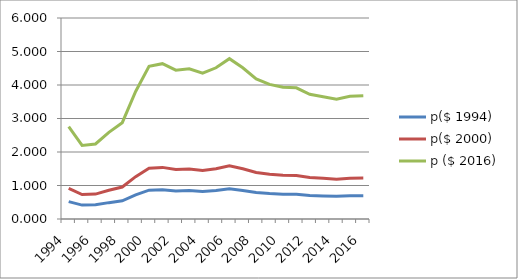
| Category | p($ 1994) | p($ 2000) | p ($ 2016) |
|---|---|---|---|
| 1994.0 | 0.52 | 0.915 | 2.754 |
| 1995.0 | 0.415 | 0.73 | 2.196 |
| 1996.0 | 0.423 | 0.744 | 2.239 |
| 1997.0 | 0.488 | 0.859 | 2.586 |
| 1998.0 | 0.543 | 0.955 | 2.875 |
| 1999.0 | 0.719 | 1.265 | 3.806 |
| 2000.0 | 0.86 | 1.514 | 4.557 |
| 2001.0 | 0.875 | 1.54 | 4.637 |
| 2002.0 | 0.839 | 1.476 | 4.443 |
| 2003.0 | 0.847 | 1.491 | 4.486 |
| 2004.0 | 0.821 | 1.445 | 4.351 |
| 2005.0 | 0.852 | 1.5 | 4.514 |
| 2006.0 | 0.904 | 1.59 | 4.786 |
| 2007.0 | 0.852 | 1.5 | 4.515 |
| 2008.0 | 0.79 | 1.39 | 4.183 |
| 2009.0 | 0.759 | 1.335 | 4.018 |
| 2010.0 | 0.742 | 1.306 | 3.931 |
| 2011.0 | 0.739 | 1.301 | 3.915 |
| 2012.0 | 0.703 | 1.237 | 3.723 |
| 2013.0 | 0.689 | 1.213 | 3.651 |
| 2014.0 | 0.676 | 1.189 | 3.579 |
| 2015.0 | 0.692 | 1.217 | 3.663 |
| 2016.0 | 0.695 | 1.223 | 3.68 |